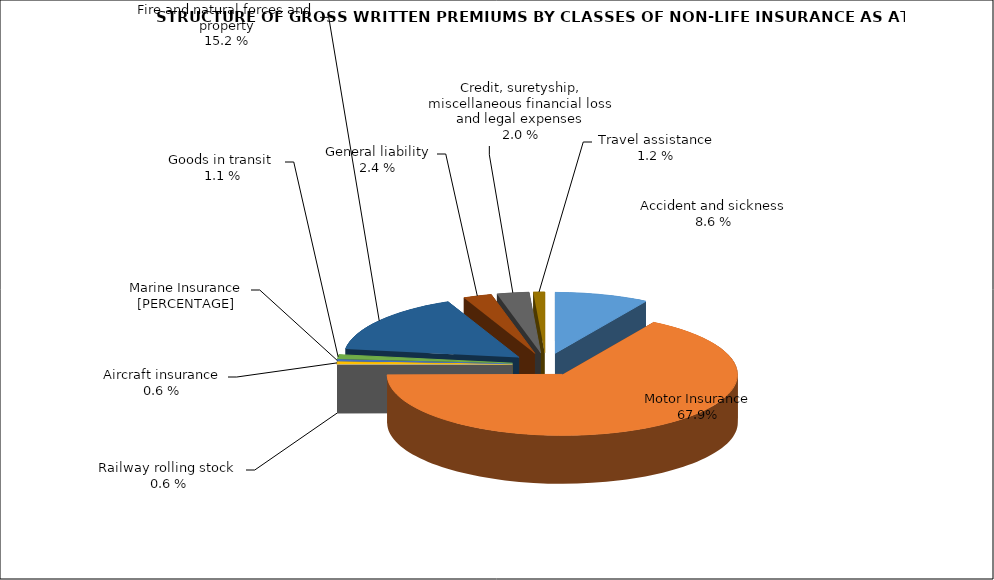
| Category | Злополука и заболяване МПС Релсови превозни средства Летателни апарати Плаванелни съдове Товари по време на превоз Пожар и природни бедствия и други щети на имущество Обща гражданска отговорност Кредити, гаранции, разни финансови загуби и правни разноски |
|---|---|
| Злополука и заболяване | 0.087 |
| МПС | 0.662 |
| Релсови превозни средства | 0.001 |
| Летателни апарати | 0.006 |
| Плаванелни съдове | 0.004 |
| Товари по време на превоз | 0.012 |
| Пожар и природни бедствия и други щети на имущество | 0.161 |
| Обща гражданска отговорност | 0.026 |
| Кредити, гаранции, разни финансови загуби и правни разноски | 0.03 |
| Помощ при пътуване | 0.01 |